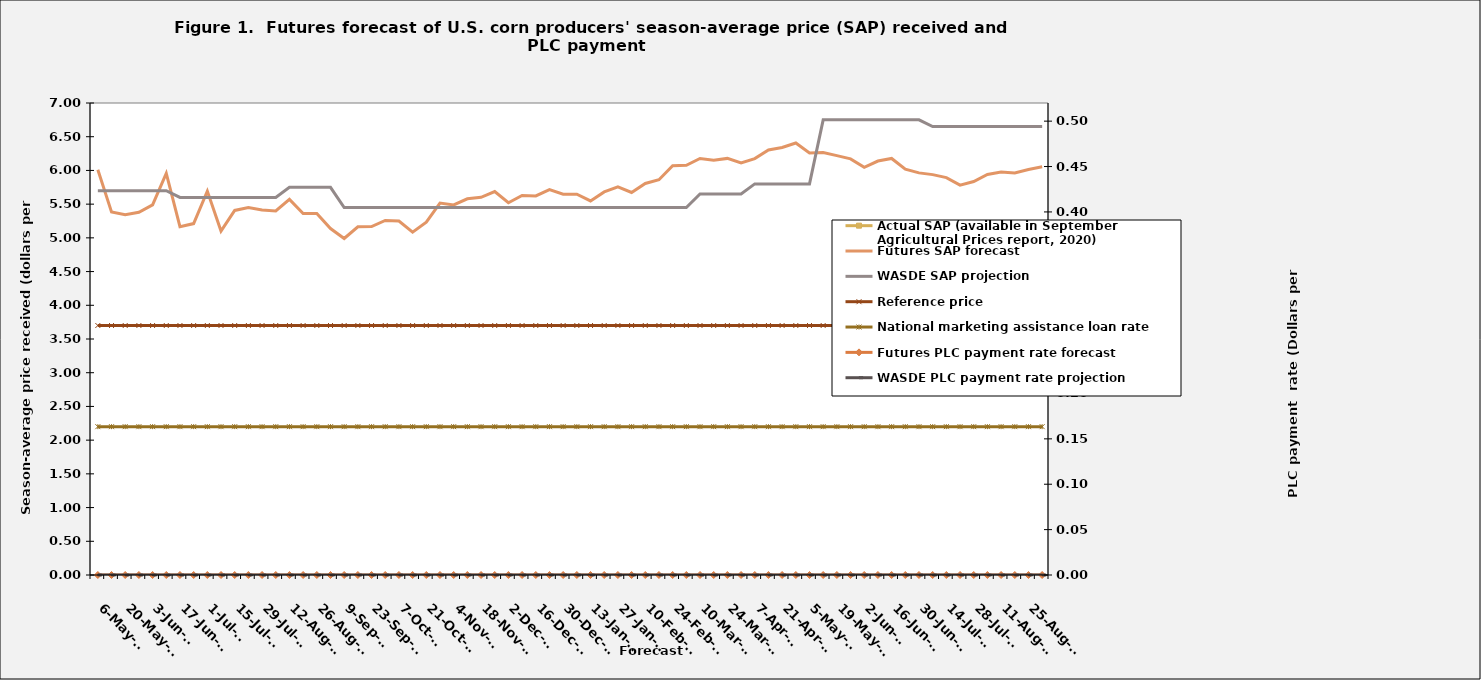
| Category | Actual SAP (available in September Agricultural Prices report, 2020) | Futures SAP forecast | WASDE SAP projection | Reference price | National marketing assistance loan rate  |
|---|---|---|---|---|---|
| 2021-05-06 |  | 6.01 | 5.7 | 3.7 | 2.2 |
| 2021-05-13 |  | 5.383 | 5.7 | 3.7 | 2.2 |
| 2021-05-20 |  | 5.342 | 5.7 | 3.7 | 2.2 |
| 2021-05-27 |  | 5.379 | 5.7 | 3.7 | 2.2 |
| 2021-06-03 |  | 5.49 | 5.7 | 3.7 | 2.2 |
| 2021-06-10 |  | 5.957 | 5.7 | 3.7 | 2.2 |
| 2021-06-17 |  | 5.166 | 5.6 | 3.7 | 2.2 |
| 2021-06-24 |  | 5.212 | 5.6 | 3.7 | 2.2 |
| 2021-07-01 |  | 5.694 | 5.6 | 3.7 | 2.2 |
| 2021-07-08 |  | 5.101 | 5.6 | 3.7 | 2.2 |
| 2021-07-15 |  | 5.406 | 5.6 | 3.7 | 2.2 |
| 2021-07-22 |  | 5.451 | 5.6 | 3.7 | 2.2 |
| 2021-07-29 |  | 5.413 | 5.6 | 3.7 | 2.2 |
| 2021-08-05 |  | 5.4 | 5.6 | 3.7 | 2.2 |
| 2021-08-12 |  | 5.571 | 5.75 | 3.7 | 2.2 |
| 2021-08-19 |  | 5.361 | 5.75 | 3.7 | 2.2 |
| 2021-08-26 |  | 5.361 | 5.75 | 3.7 | 2.2 |
| 2021-09-02 |  | 5.139 | 5.75 | 3.7 | 2.2 |
| 2021-09-09 |  | 4.99 | 5.45 | 3.7 | 2.2 |
| 2021-09-16 |  | 5.165 | 5.45 | 3.7 | 2.2 |
| 2021-09-23 |  | 5.167 | 5.45 | 3.7 | 2.2 |
| 2021-09-30 |  | 5.258 | 5.45 | 3.7 | 2.2 |
| 2021-10-07 |  | 5.249 | 5.45 | 3.7 | 2.2 |
| 2021-10-14 |  | 5.085 | 5.45 | 3.7 | 2.2 |
| 2021-10-21 |  | 5.234 | 5.45 | 3.7 | 2.2 |
| 2021-10-28 |  | 5.516 | 5.45 | 3.7 | 2.2 |
| 2021-11-04 |  | 5.489 | 5.45 | 3.7 | 2.2 |
| 2021-11-11 |  | 5.579 | 5.45 | 3.7 | 2.2 |
| 2021-11-18 |  | 5.602 | 5.45 | 3.7 | 2.2 |
| 2021-11-25 |  | 5.687 | 5.45 | 3.7 | 2.2 |
| 2021-12-02 |  | 5.52 | 5.45 | 3.7 | 2.2 |
| 2021-12-09 |  | 5.628 | 5.45 | 3.7 | 2.2 |
| 2021-12-16 |  | 5.623 | 5.45 | 3.7 | 2.2 |
| 2021-12-23 |  | 5.715 | 5.45 | 3.7 | 2.2 |
| 2021-12-30 |  | 5.646 | 5.45 | 3.7 | 2.2 |
| 2022-01-06 |  | 5.646 | 5.45 | 3.7 | 2.2 |
| 2022-01-13 |  | 5.548 | 5.45 | 3.7 | 2.2 |
| 2022-01-20 |  | 5.681 | 5.45 | 3.7 | 2.2 |
| 2022-01-27 |  | 5.757 | 5.45 | 3.7 | 2.2 |
| 2022-02-03 |  | 5.673 | 5.45 | 3.7 | 2.2 |
| 2022-02-10 |  | 5.807 | 5.45 | 3.7 | 2.2 |
| 2022-02-17 |  | 5.862 | 5.45 | 3.7 | 2.2 |
| 2022-02-24 |  | 6.069 | 5.45 | 3.7 | 2.2 |
| 2022-03-03 |  | 6.076 | 5.45 | 3.7 | 2.2 |
| 2022-03-10 |  | 6.177 | 5.65 | 3.7 | 2.2 |
| 2022-03-17 |  | 6.153 | 5.65 | 3.7 | 2.2 |
| 2022-03-24 |  | 6.178 | 5.65 | 3.7 | 2.2 |
| 2022-03-31 |  | 6.11 | 5.65 | 3.7 | 2.2 |
| 2022-04-07 |  | 6.176 | 5.8 | 3.7 | 2.2 |
| 2022-04-14 |  | 6.304 | 5.8 | 3.7 | 2.2 |
| 2022-04-21 |  | 6.34 | 5.8 | 3.7 | 2.2 |
| 2022-04-28 |  | 6.406 | 5.8 | 3.7 | 2.2 |
| 2022-05-05 |  | 6.258 | 5.8 | 3.7 | 2.2 |
| 2022-05-12 |  | 6.266 | 6.75 | 3.7 | 2.2 |
| 2022-05-19 |  | 6.219 | 6.75 | 3.7 | 2.2 |
| 2022-05-26 |  | 6.172 | 6.75 | 3.7 | 2.2 |
| 2022-06-02 |  | 6.047 | 6.75 | 3.7 | 2.2 |
| 2022-06-09 |  | 6.139 | 6.75 | 3.7 | 2.2 |
| 2022-06-16 |  | 6.178 | 6.75 | 3.7 | 2.2 |
| 2022-06-23 |  | 6.018 | 6.75 | 3.7 | 2.2 |
| 2022-06-30 |  | 5.964 | 6.75 | 3.7 | 2.2 |
| 2022-07-07 |  | 5.938 | 6.65 | 3.7 | 2.2 |
| 2022-07-14 |  | 5.893 | 6.65 | 3.7 | 2.2 |
| 2022-07-21 |  | 5.782 | 6.65 | 3.7 | 2.2 |
| 2022-07-28 |  | 5.836 | 6.65 | 3.7 | 2.2 |
| 2022-08-04 |  | 5.94 | 6.65 | 3.7 | 2.2 |
| 2022-08-11 |  | 5.976 | 6.65 | 3.7 | 2.2 |
| 2022-08-18 |  | 5.963 | 6.65 | 3.7 | 2.2 |
| 2022-08-25 |  | 6.015 | 6.65 | 3.7 | 2.2 |
| 2022-09-01 |  | 6.053 | 6.65 | 3.7 | 2.2 |